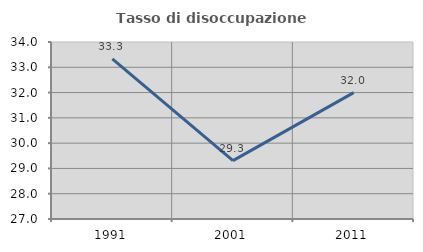
| Category | Tasso di disoccupazione giovanile  |
|---|---|
| 1991.0 | 33.333 |
| 2001.0 | 29.31 |
| 2011.0 | 32 |